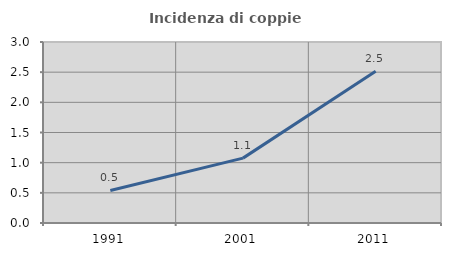
| Category | Incidenza di coppie miste |
|---|---|
| 1991.0 | 0.539 |
| 2001.0 | 1.075 |
| 2011.0 | 2.516 |